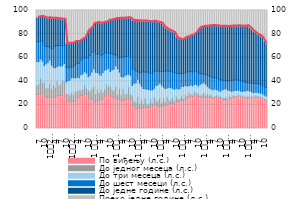
| Category | По виђењу (л.с.) | До једног месеца (л.с.) | До три месеца (л.с.) | До шест месеци (л.с.) | До једне године (л.с.) | Преко једне године (л.с.) |
|---|---|---|---|---|---|---|
| 7 | 28.901 | 7.538 | 20.318 | 16.513 | 21.086 | 5.635 |
| 8 | 28.993 | 8.638 | 19.197 | 16.611 | 20.966 | 5.594 |
| 9 | 28.645 | 13.978 | 16.331 | 15.658 | 20.26 | 5.128 |
| 10 | 29.783 | 9.095 | 18.198 | 16.32 | 21.492 | 5.128 |
| 11 | 27.404 | 11.55 | 14.425 | 17.426 | 23.487 | 5.716 |
| 12 | 26.887 | 6.935 | 21.065 | 14.581 | 24.185 | 6.347 |
| 1
2010. | 26.027 | 7.975 | 21.833 | 13.443 | 24.465 | 6.257 |
| 2 | 26.941 | 11.028 | 19.977 | 10.911 | 24.909 | 6.219 |
| 3 | 26.043 | 7.384 | 20.176 | 14.051 | 25.809 | 6.529 |
| 4 | 26.32 | 10.713 | 14.801 | 16.026 | 25.648 | 6.491 |
| 5 | 26.478 | 8.173 | 16.819 | 18.155 | 23.822 | 6.552 |
| 6 | 27.626 | 12.105 | 12.636 | 17.909 | 22.956 | 6.768 |
| 7 | 27.874 | 8.428 | 17.006 | 17.039 | 22.647 | 7.014 |
| 8 | 28.022 | 9.585 | 15.225 | 17.296 | 22.723 | 7.14 |
| 9 | 28.274 | 12.39 | 13.026 | 16.415 | 22.549 | 7.336 |
| 10 | 31.825 | 8.282 | 15.051 | 14.74 | 22.549 | 7.553 |
| 11 | 22.732 | 6.945 | 9.979 | 12.399 | 20.356 | 27.589 |
| 12 | 23.353 | 5.165 | 12.223 | 11.235 | 20.307 | 27.71 |
| 1
2011. | 22.754 | 5.602 | 12.808 | 10.579 | 20.345 | 27.897 |
| 2 | 23.066 | 7.429 | 12.568 | 9.102 | 19.982 | 27.838 |
| 3 | 23.049 | 5.791 | 14.26 | 9.847 | 19.664 | 27.396 |
| 4 | 23.545 | 8.128 | 11.059 | 10.973 | 20.119 | 26.175 |
| 5 | 27.613 | 3.885 | 12.213 | 11.633 | 18.484 | 26.188 |
| 6 | 26.029 | 6.678 | 10.375 | 12.252 | 18.261 | 26.419 |
| 7 | 28.21 | 4.209 | 13.098 | 12.364 | 17.106 | 25.019 |
| 8 | 27.733 | 5.329 | 13.376 | 12.922 | 16.674 | 23.973 |
| 9 | 29.107 | 7.817 | 11.216 | 12.325 | 16.169 | 23.367 |
| 10 | 28.744 | 5.56 | 12.693 | 12.55 | 20.285 | 20.175 |
| 11 | 25.439 | 7.22 | 11.201 | 16.255 | 23.048 | 16.837 |
| 12 | 24.335 | 6.773 | 14.1 | 16.895 | 22.371 | 15.521 |
| 1 
2012. | 25.318 | 8.164 | 14.349 | 16.778 | 21.172 | 14.22 |
| 2 | 23.026 | 12.531 | 14.984 | 14.946 | 23.539 | 10.975 |
| 3 | 21.736 | 7.361 | 18.474 | 15.39 | 26.226 | 10.813 |
| 4 | 23.532 | 9.83 | 14.03 | 15.285 | 27.115 | 10.213 |
| 5 | 24.032 | 6.223 | 16.027 | 17.367 | 25.946 | 10.406 |
| 6 | 24.662 | 8.629 | 11.93 | 16.755 | 27.121 | 10.908 |
| 7 | 25.262 | 5.074 | 17.016 | 15.592 | 26.651 | 10.41 |
| 8 | 27.084 | 6.185 | 16.064 | 14.55 | 26.124 | 9.992 |
| 9 | 28.071 | 9.521 | 12.497 | 13.789 | 26.337 | 9.79 |
| 10 | 29.725 | 5.803 | 15.517 | 13.344 | 27.305 | 8.305 |
| 11 | 27.739 | 8.403 | 12.066 | 15.131 | 28.405 | 8.255 |
| 12 | 26.642 | 5.905 | 17.226 | 13.488 | 28.945 | 7.794 |
| 1 
2013. | 25.96 | 5.968 | 18.439 | 12.173 | 29.901 | 7.56 |
| 2 | 25.853 | 9.739 | 17.541 | 9.217 | 30.897 | 6.759 |
| 3 | 24.711 | 4.254 | 21.868 | 9.593 | 32.835 | 6.739 |
| 4 | 24.536 | 9.372 | 13.892 | 12.117 | 33.415 | 6.674 |
| 5 | 23.775 | 4.398 | 15.884 | 16.495 | 32.862 | 6.585 |
| 6 | 23.709 | 9.567 | 10.417 | 16.761 | 33.029 | 6.518 |
| 7 | 24.436 | 3.983 | 16.282 | 16.314 | 32.61 | 6.375 |
| 8 | 24.88 | 4.515 | 16.416 | 15.445 | 32.444 | 6.3 |
| 9 | 24.427 | 10.902 | 10.679 | 15.569 | 32.261 | 6.162 |
| 10 | 23.838 | 4.948 | 16.084 | 15.38 | 33.211 | 6.538 |
| 11 | 19.061 | 8.95 | 8.324 | 14.775 | 40.676 | 8.207 |
| 12 | 18.573 | 4.342 | 15.419 | 11.903 | 41.435 | 8.327 |
| 1 
2014. | 17.055 | 5.14 | 16.572 | 10.247 | 42.398 | 8.588 |
| 2 | 17.17 | 9.427 | 15.126 | 6.46 | 43.154 | 8.663 |
| 3 | 17.076 | 3.559 | 17.818 | 8.975 | 43.8 | 8.774 |
| 4 | 16.758 | 8.149 | 11.021 | 11.172 | 44.037 | 8.862 |
| 5 | 17.893 | 2.956 | 13.123 | 14.112 | 43.097 | 8.819 |
| 6 | 17.633 | 7.774 | 8.234 | 14.155 | 43.269 | 8.935 |
| 7 | 17.747 | 2.861 | 12.967 | 14.378 | 42.996 | 9.054 |
| 8 | 17.728 | 2.991 | 12.37 | 14.156 | 43.415 | 9.339 |
| 9 | 18.048 | 7.014 | 7.656 | 14.043 | 43.793 | 9.443 |
| 10 | 18.548 | 2.983 | 11.2 | 13.563 | 44.062 | 9.644 |
| 11 | 20.15 | 6.459 | 7.431 | 14.098 | 42.924 | 8.938 |
| 12 | 19.875 | 3.705 | 12.888 | 12.534 | 41.453 | 9.549 |
| 1 
2015. | 18.592 | 4.059 | 14.45 | 11.693 | 41.236 | 9.969 |
| 2 | 18.507 | 7.079 | 12.948 | 9.428 | 41.928 | 10.11 |
| 3 | 18.778 | 3.163 | 14.75 | 11.617 | 40.931 | 10.76 |
| 4 | 19.136 | 6.378 | 9.506 | 13.244 | 38.716 | 13.023 |
| 5 | 19.7 | 2.694 | 11.404 | 14.852 | 36.754 | 14.596 |
| 6 | 20.149 | 6.345 | 7.747 | 14.572 | 35.579 | 15.605 |
| 7 | 20.745 | 2.744 | 11.369 | 13.754 | 34.861 | 16.527 |
| 8 | 21.088 | 2.877 | 10.485 | 14.024 | 34.224 | 17.302 |
| 9 | 21.01 | 5.473 | 7.604 | 13.841 | 34.068 | 18.006 |
| 10 | 20.729 | 2.558 | 9.852 | 13.944 | 34.023 | 18.897 |
| 11 | 22.679 | 4.626 | 6.703 | 13.37 | 30.353 | 22.27 |
| 12 | 22.82 | 1.711 | 9.023 | 12.993 | 29.552 | 23.902 |
| 1 
2016. | 23.451 | 1.818 | 8.732 | 12.796 | 29.163 | 24.042 |
| 2 | 23.937 | 4.134 | 7.649 | 10.961 | 28.542 | 24.773 |
| 3 | 23.645 | 1.711 | 10.192 | 10.958 | 29.036 | 24.46 |
| 4 | 24.715 | 4.049 | 7.742 | 10.673 | 30.16 | 22.662 |
| 5 | 25.753 | 1.487 | 8.684 | 11.944 | 29.605 | 22.529 |
| 6 | 26.45 | 3.886 | 5.806 | 11.853 | 30.131 | 21.874 |
| 7 | 27.536 | 1.047 | 8.314 | 11.694 | 30.158 | 21.246 |
| 8 | 26.95 | 1.347 | 7.978 | 11.661 | 31.282 | 20.782 |
| 9 | 28.377 | 3.066 | 6.023 | 11.135 | 31.678 | 19.722 |
| 10 | 28.467 | 1.384 | 7.36 | 11.125 | 33.093 | 18.571 |
| 11 | 27.029 | 3.046 | 5.894 | 10.887 | 37.233 | 15.911 |
| 12 | 26.689 | 0.92 | 9.846 | 9.375 | 38.774 | 14.396 |
| 1 
2017. | 26.167 | 2.269 | 9.631 | 8.247 | 39.827 | 13.859 |
| 2 | 26.508 | 3.857 | 8.825 | 6.825 | 40.535 | 13.45 |
| 3 | 26.428 | 1.619 | 9.405 | 8.297 | 40.9 | 13.352 |
| 4 | 26.618 | 2.87 | 6.328 | 9.363 | 41.552 | 13.269 |
| 5 | 26.477 | 1.515 | 6.288 | 10.373 | 42.461 | 12.886 |
| 6 | 26.57 | 2.116 | 4.935 | 10.313 | 43.136 | 12.93 |
| 7 | 25.618 | 0.768 | 6.362 | 10.31 | 44.257 | 12.685 |
| 8 | 26.475 | 0.836 | 6.193 | 9.805 | 43.924 | 12.767 |
| 9 | 26.638 | 2.073 | 4.242 | 9.746 | 44.354 | 12.947 |
| 10 | 26.242 | 0.895 | 5.264 | 9.729 | 44.805 | 13.065 |
| 11 | 25.596 | 1.982 | 3.91 | 10.071 | 44.924 | 13.517 |
| 12 | 25.244 | 0.644 | 6.707 | 8.537 | 45.536 | 13.332 |
| 1 
2018. | 24.559 | 0.971 | 7.629 | 7.643 | 45.857 | 13.341 |
| 2 | 24.567 | 2.02 | 7.344 | 6.613 | 46.054 | 13.402 |
| 3 | 24.696 | 0.658 | 7.153 | 7.423 | 46.386 | 13.685 |
| 4 | 25.594 | 1.919 | 4.915 | 8.275 | 45.886 | 13.412 |
| 5 | 25.804 | 0.604 | 5.058 | 9.11 | 46.168 | 13.256 |
| 6 | 26.252 | 1.71 | 3.9 | 8.969 | 46.031 | 13.138 |
| 7 | 26.72 | 0.66 | 5.033 | 8.857 | 45.63 | 13.101 |
| 8 | 26.986 | 0.683 | 4.8 | 8.584 | 45.892 | 13.055 |
| 9 | 27.561 | 1.471 | 3.473 | 8.659 | 45.852 | 12.984 |
| 10 | 26.931 | 0.808 | 4.104 | 8.931 | 46.173 | 13.054 |
| 11 | 26.591 | 1.367 | 3.396 | 8.925 | 46.32 | 13.4 |
| 12 | 26.303 | 0.507 | 4.946 | 7.921 | 47.175 | 13.149 |
| 1 
2019. | 26.066 | 0.596 | 5.244 | 7.242 | 47.721 | 13.13 |
| 2 | 25.996 | 1.21 | 5.211 | 6.298 | 48.37 | 12.916 |
| 3 | 26.071 | 0.581 | 5.116 | 6.952 | 46.874 | 14.406 |
| 4 | 26.479 | 1.112 | 3.674 | 7.3 | 45.702 | 15.733 |
| 5 | 26.212 | 0.547 | 3.619 | 7.815 | 44.314 | 17.493 |
| 6 | 26.676 | 1.041 | 2.987 | 7.513 | 43.108 | 18.676 |
| 7 | 26.719 | 0.542 | 3.378 | 7.398 | 42.005 | 19.958 |
| 8 | 26.427 | 0.567 | 3.359 | 7.312 | 41.501 | 20.835 |
| 9 | 26.324 | 0.944 | 2.79 | 7.207 | 41.118 | 21.616 |
| 10 | 25.726 | 0.527 | 3.298 | 7.207 | 40.228 | 23.013 |
| 11 | 24.433 | 1.048 | 2.859 | 7.155 | 38.49 | 26.015 |
| 12 | 23.821 | 0.491 | 3.235 | 7.242 | 36.948 | 28.264 |